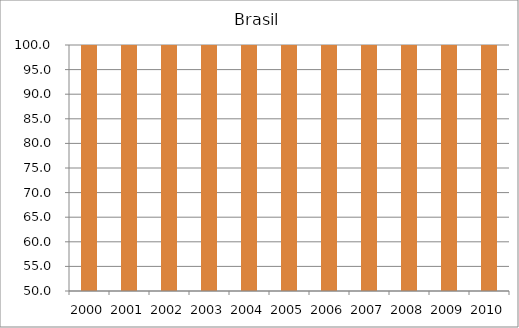
| Category | Brasil |
|---|---|
| 2000.0 | 111.7 |
| 2001.0 | 112.6 |
| 2002.0 | 110.3 |
| 2003.0 | 108.5 |
| 2004.0 | 106.4 |
| 2005.0 | 106.5 |
| 2006.0 | 110 |
| 2007.0 | 111.1 |
| 2008.0 | 108.4 |
| 2009.0 | 106 |
| 2010.0 | 106.03 |